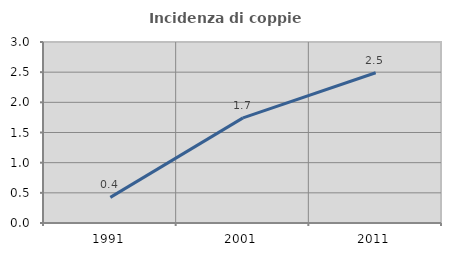
| Category | Incidenza di coppie miste |
|---|---|
| 1991.0 | 0.425 |
| 2001.0 | 1.742 |
| 2011.0 | 2.49 |